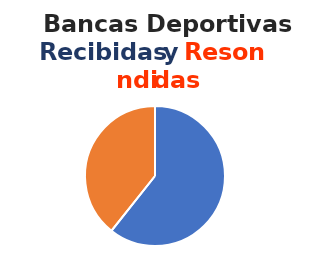
| Category | Series 0 |
|---|---|
| 0 | 139 |
| 1 | 90 |